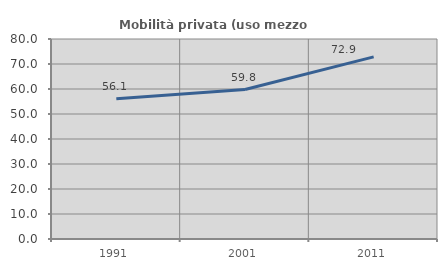
| Category | Mobilità privata (uso mezzo privato) |
|---|---|
| 1991.0 | 56.089 |
| 2001.0 | 59.797 |
| 2011.0 | 72.861 |